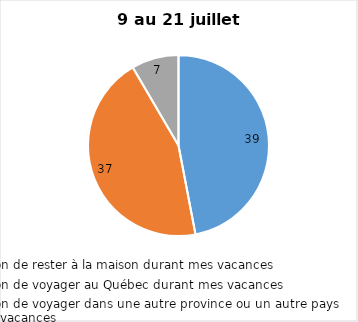
| Category | Series 0 |
|---|---|
| J’ai l’intention de rester à la maison durant mes vacances | 39 |
| J’ai l’intention de voyager au Québec durant mes vacances | 37 |
| J’ai l’intention de voyager dans une autre province ou un autre pays durant mes vacances | 7 |